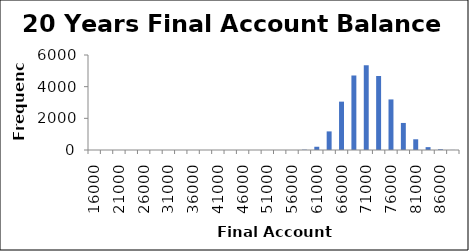
| Category | Frequency |
|---|---|
| 16000.0 | 0 |
| 18500.0 | 0 |
| 21000.0 | 0 |
| 23500.0 | 0 |
| 26000.0 | 0 |
| 28500.0 | 0 |
| 31000.0 | 0 |
| 33500.0 | 0 |
| 36000.0 | 0 |
| 38500.0 | 0 |
| 41000.0 | 0 |
| 43500.0 | 0 |
| 46000.0 | 0 |
| 48500.0 | 0 |
| 51000.0 | 0 |
| 53500.0 | 0 |
| 56000.0 | 0 |
| 58500.0 | 21 |
| 61000.0 | 205 |
| 63500.0 | 1175 |
| 66000.0 | 3054 |
| 68500.0 | 4706 |
| 71000.0 | 5352 |
| 73500.0 | 4674 |
| 76000.0 | 3194 |
| 78500.0 | 1708 |
| 81000.0 | 677 |
| 83500.0 | 181 |
| 86000.0 | 47 |
| More | 6 |